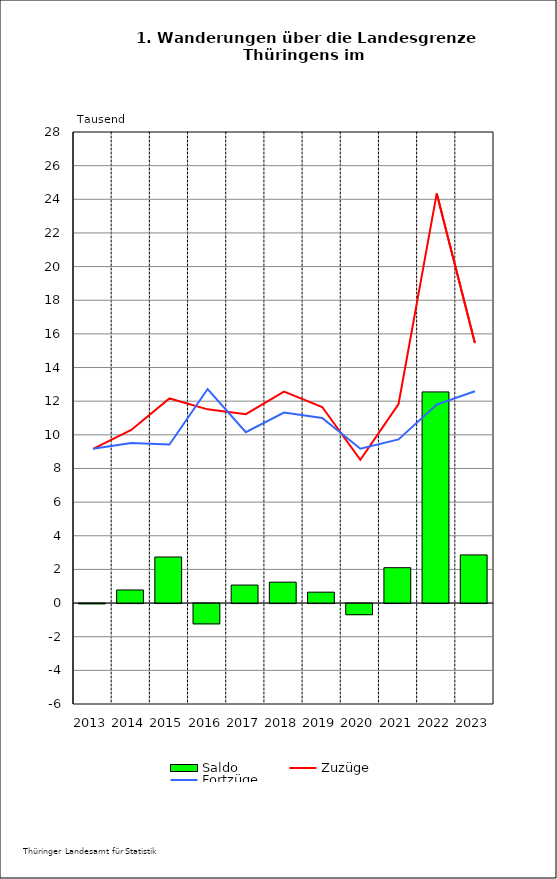
| Category | Saldo |
|---|---|
| 2013.0 | -0.016 |
| 2014.0 | 0.777 |
| 2015.0 | 2.738 |
| 2016.0 | -1.207 |
| 2017.0 | 1.069 |
| 2018.0 | 1.243 |
| 2019.0 | 0.647 |
| 2020.0 | -0.662 |
| 2021.0 | 2.102 |
| 2022.0 | 12.55 |
| 2023.0 | 2.862 |